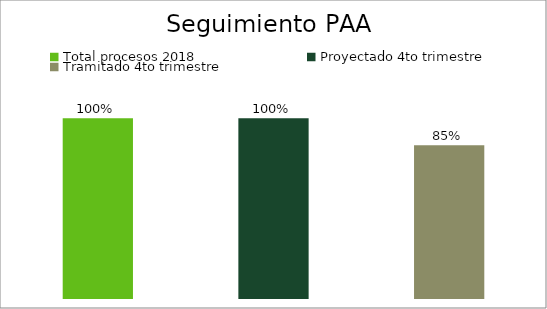
| Category | Series 0 |
|---|---|
| Total procesos 2018 | 1 |
| Proyectado 4to trimestre | 1 |
| Tramitado 4to trimestre | 0.851 |